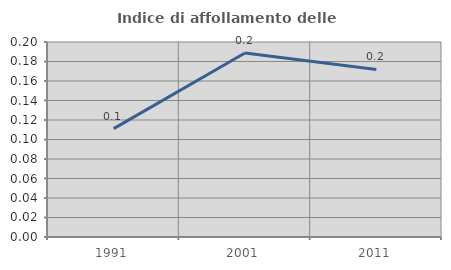
| Category | Indice di affollamento delle abitazioni  |
|---|---|
| 1991.0 | 0.111 |
| 2001.0 | 0.189 |
| 2011.0 | 0.172 |